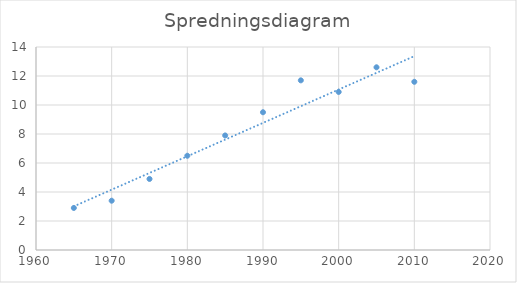
| Category | Series 0 |
|---|---|
| 1965.0 | 2.9 |
| 1970.0 | 3.4 |
| 1975.0 | 4.9 |
| 1980.0 | 6.5 |
| 1985.0 | 7.9 |
| 1990.0 | 9.5 |
| 1995.0 | 11.7 |
| 2000.0 | 10.9 |
| 2005.0 | 12.6 |
| 2010.0 | 11.6 |